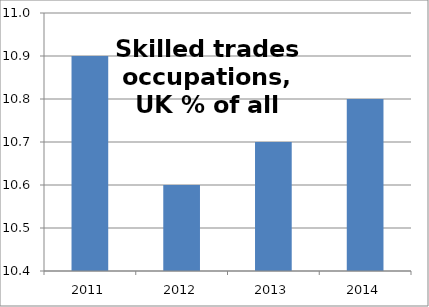
| Category | 5: Skilled trades occupations |
|---|---|
| 2011.0 | 10.9 |
| 2012.0 | 10.6 |
| 2013.0 | 10.7 |
| 2014.0 | 10.8 |